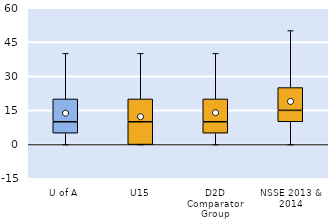
| Category | 25th | 50th | 75th |
|---|---|---|---|
| U of A | 5 | 5 | 10 |
| U15 | 0 | 10 | 10 |
| D2D Comparator Group | 5 | 5 | 10 |
| NSSE 2013 & 2014 | 10 | 5 | 10 |